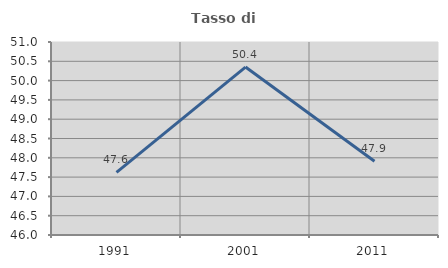
| Category | Tasso di occupazione   |
|---|---|
| 1991.0 | 47.623 |
| 2001.0 | 50.351 |
| 2011.0 | 47.91 |